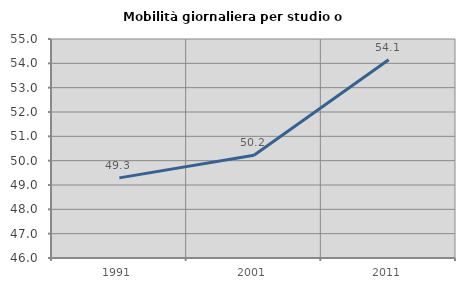
| Category | Mobilità giornaliera per studio o lavoro |
|---|---|
| 1991.0 | 49.292 |
| 2001.0 | 50.225 |
| 2011.0 | 54.148 |